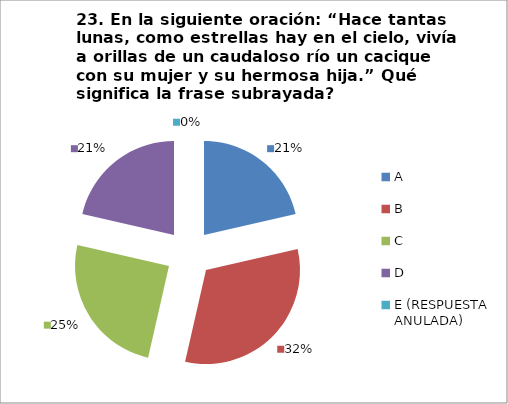
| Category | CANTIDAD DE RESPUESTAS PREGUNTA (23) | PORCENTAJE |
|---|---|---|
| A | 6 | 0.214 |
| B | 9 | 0.321 |
| C | 7 | 0.25 |
| D | 6 | 0.214 |
| E (RESPUESTA ANULADA) | 0 | 0 |